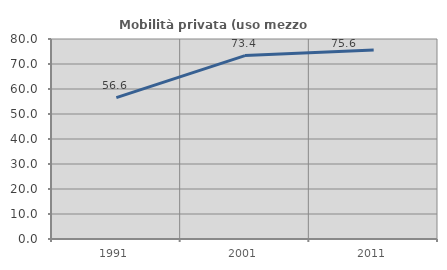
| Category | Mobilità privata (uso mezzo privato) |
|---|---|
| 1991.0 | 56.566 |
| 2001.0 | 73.371 |
| 2011.0 | 75.594 |